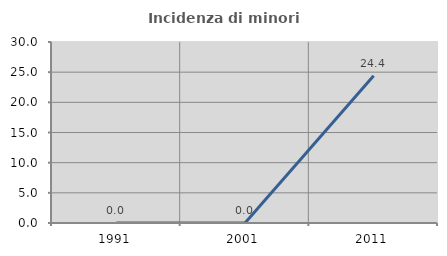
| Category | Incidenza di minori stranieri |
|---|---|
| 1991.0 | 0 |
| 2001.0 | 0 |
| 2011.0 | 24.39 |